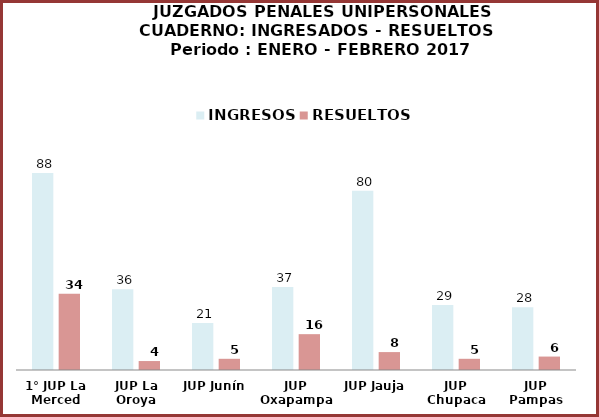
| Category | INGRESOS | RESUELTOS |
|---|---|---|
| 1° JUP La Merced | 88 | 34 |
| JUP La Oroya | 36 | 4 |
| JUP Junín | 21 | 5 |
| JUP Oxapampa | 37 | 16 |
| JUP Jauja | 80 | 8 |
| JUP Chupaca | 29 | 5 |
| JUP Pampas | 28 | 6 |